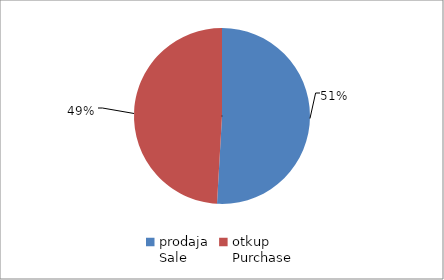
| Category | Series 0 |
|---|---|
| prodaja
Sale | 71671620.97 |
| otkup
Purchase | 69121396.73 |